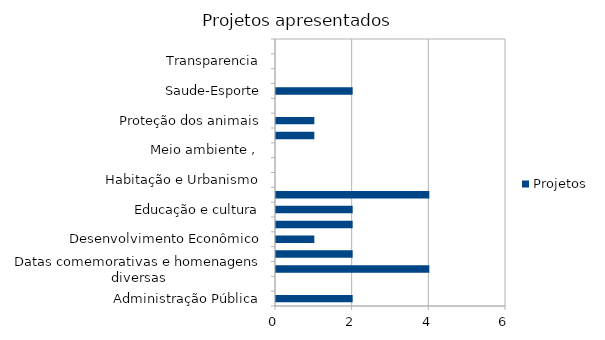
| Category | Projetos |
|---|---|
| Administração Pública | 2 |
| Combate à corrupção  | 0 |
| Datas comemorativas e homenagens diversas | 4 |
| Denominação de logradouro | 2 |
| Desenvolvimento Econômico | 1 |
| Desenvolvimento Social  | 2 |
| Educação e cultura | 2 |
| Frente parlamentar | 4 |
| Habitação e Urbanismo | 0 |
| Lei Orgânica do Município | 0 |
| Meio ambiente ,  | 0 |
| Mobilidade | 1 |
| Proteção dos animais | 1 |
| Regimento Interno da CMSP | 0 |
| Saude-Esporte | 2 |
| Segurança Pública | 0 |
| Transparencia | 0 |
| Tributação | 0 |